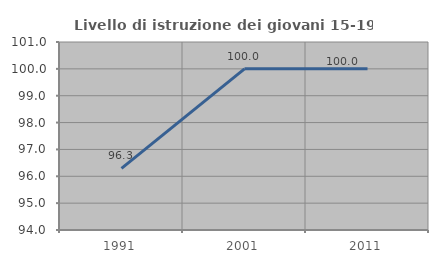
| Category | Livello di istruzione dei giovani 15-19 anni |
|---|---|
| 1991.0 | 96.296 |
| 2001.0 | 100 |
| 2011.0 | 100 |